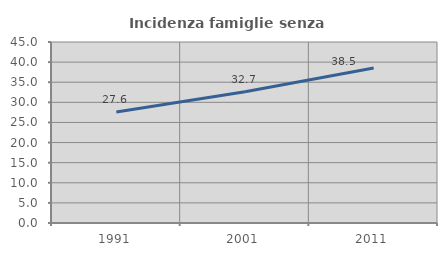
| Category | Incidenza famiglie senza nuclei |
|---|---|
| 1991.0 | 27.584 |
| 2001.0 | 32.654 |
| 2011.0 | 38.512 |